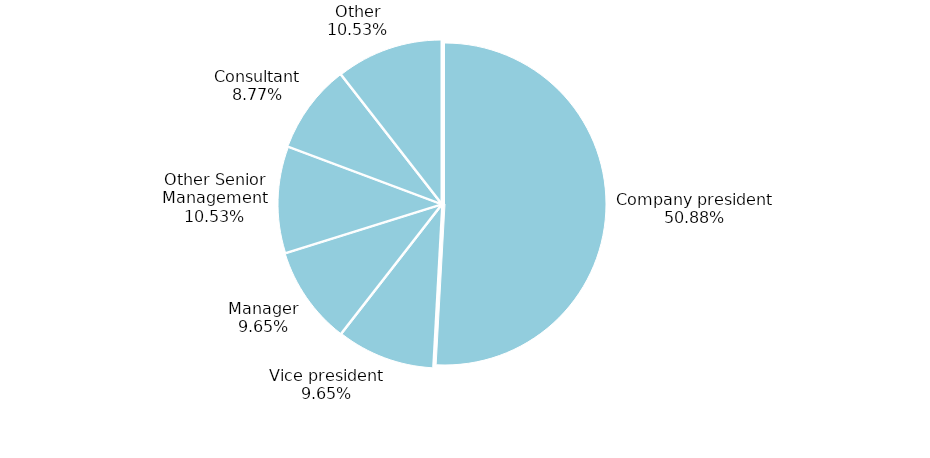
| Category | Series 0 |
|---|---|
| Company president | 0.509 |
| Vice president | 0.096 |
| Manager | 0.096 |
| Other Senior Management | 0.105 |
| Consultant | 0.088 |
| Other | 0.105 |